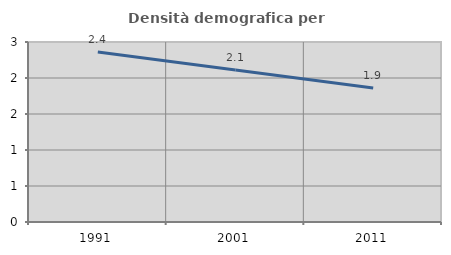
| Category | Densità demografica |
|---|---|
| 1991.0 | 2.36 |
| 2001.0 | 2.11 |
| 2011.0 | 1.86 |